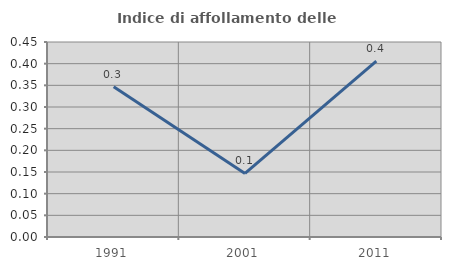
| Category | Indice di affollamento delle abitazioni  |
|---|---|
| 1991.0 | 0.347 |
| 2001.0 | 0.147 |
| 2011.0 | 0.406 |